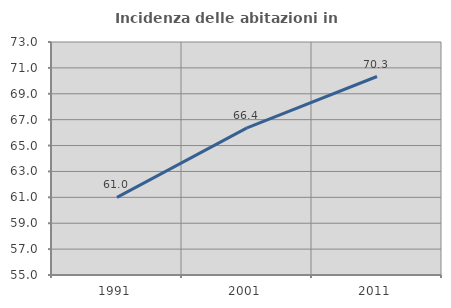
| Category | Incidenza delle abitazioni in proprietà  |
|---|---|
| 1991.0 | 60.991 |
| 2001.0 | 66.361 |
| 2011.0 | 70.334 |